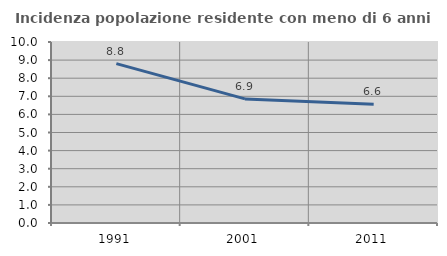
| Category | Incidenza popolazione residente con meno di 6 anni |
|---|---|
| 1991.0 | 8.807 |
| 2001.0 | 6.856 |
| 2011.0 | 6.558 |